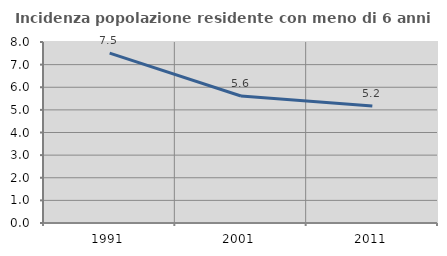
| Category | Incidenza popolazione residente con meno di 6 anni |
|---|---|
| 1991.0 | 7.506 |
| 2001.0 | 5.614 |
| 2011.0 | 5.171 |